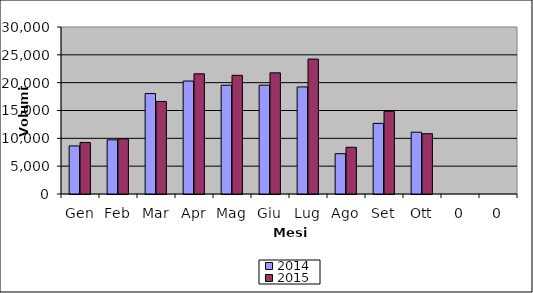
| Category | 2014 | 2015 |
|---|---|---|
| Gen | 8634 | 9246 |
| Feb | 9730 | 9910 |
| Mar | 18040 | 16621 |
| Apr | 20292 | 21596 |
| Mag | 19538 | 21316 |
| Giu | 19547 | 21767 |
| Lug | 19233 | 24236 |
| Ago | 7240 | 8389 |
| Set | 12684 | 14865 |
| Ott | 11096 | 10830 |
| 0 | 0 | 0 |
| 0 | 0 | 0 |